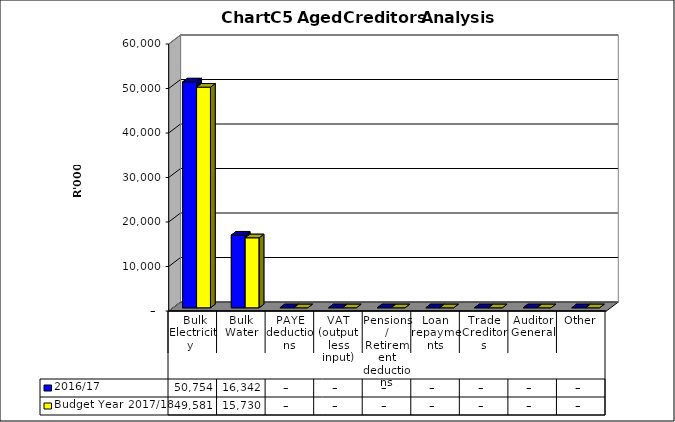
| Category | 2016/17 | Budget Year 2017/18 |
|---|---|---|
|  Bulk Electricity  | 50754365.65 | 49581367 |
| Bulk Water | 16341845.88 | 15730426 |
| PAYE deductions | 0 | 0 |
| VAT (output less input) | 0 | 0 |
| Pensions / Retirement deductions | 0 | 0 |
| Loan repayments | 0 | 0 |
| Trade Creditors | 0 | 0 |
| Auditor General | 0 | 0 |
| Other | 0 | 0 |